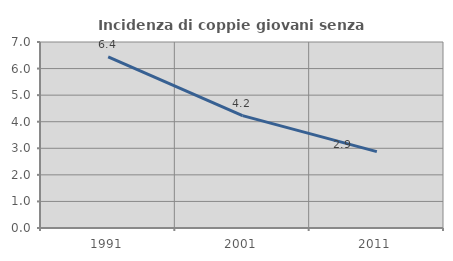
| Category | Incidenza di coppie giovani senza figli |
|---|---|
| 1991.0 | 6.437 |
| 2001.0 | 4.228 |
| 2011.0 | 2.873 |